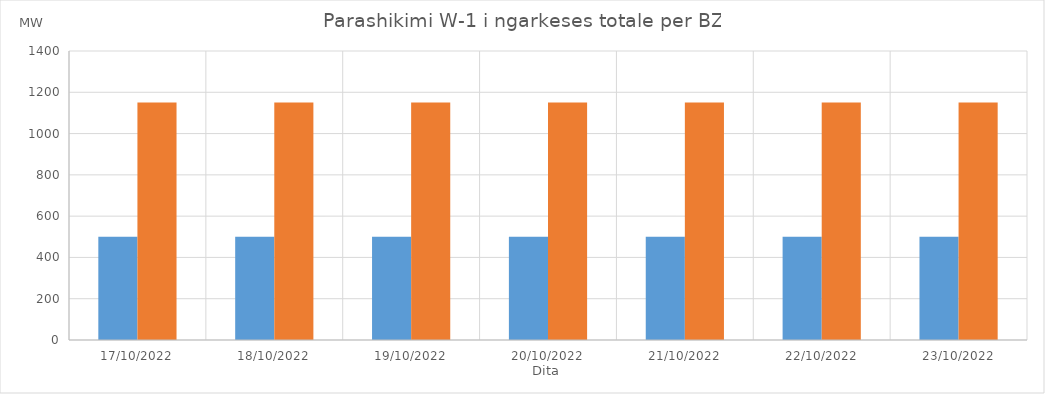
| Category | Min (MW) | Max (MW) |
|---|---|---|
| 17/10/2022 | 500 | 1150 |
| 18/10/2022 | 500 | 1150 |
| 19/10/2022 | 500 | 1150 |
| 20/10/2022 | 500 | 1150 |
| 21/10/2022 | 500 | 1150 |
| 22/10/2022 | 500 | 1150 |
| 23/10/2022 | 500 | 1150 |